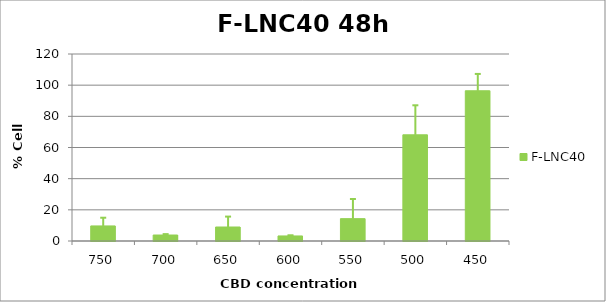
| Category | F-LNC40 |
|---|---|
| 750.0 | 9.663 |
| 700.0 | 3.835 |
| 650.0 | 8.977 |
| 600.0 | 3.235 |
| 550.0 | 14.337 |
| 500.0 | 68.14 |
| 450.0 | 96.399 |